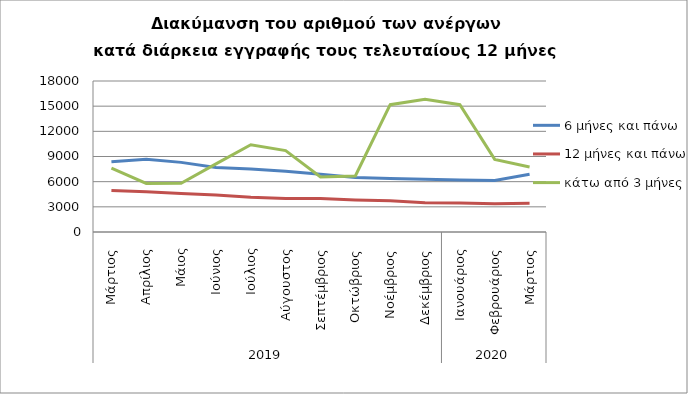
| Category | 6 μήνες και πάνω | 12 μήνες και πάνω | κάτω από 3 μήνες |
|---|---|---|---|
| 0 | 8385 | 4952 | 7600 |
| 1 | 8657 | 4796 | 5790 |
| 2 | 8300 | 4594 | 5815 |
| 3 | 7689 | 4420 | 8126 |
| 4 | 7497 | 4136 | 10405 |
| 5 | 7250 | 3992 | 9701 |
| 6 | 6882 | 3982 | 6563 |
| 7 | 6500 | 3821 | 6686 |
| 8 | 6379 | 3715 | 15176 |
| 9 | 6275 | 3478 | 15812 |
| 10 | 6184 | 3454 | 15175 |
| 11 | 6133 | 3369 | 8651 |
| 12 | 6894 | 3423 | 7759 |